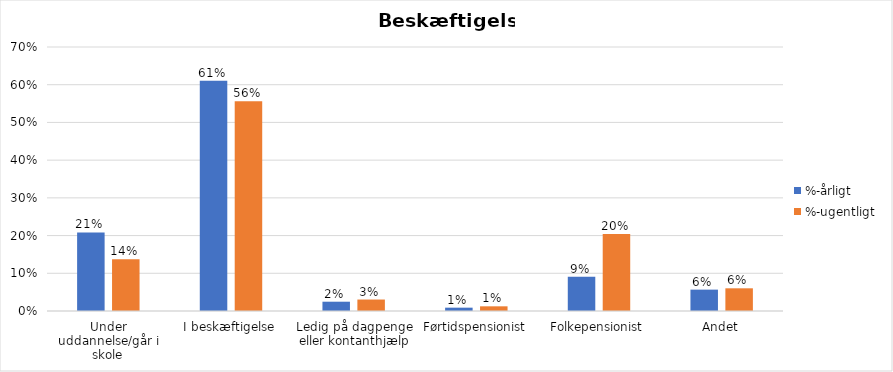
| Category | %-årligt | %-ugentligt |
|---|---|---|
| Under uddannelse/går i skole | 0.208 | 0.137 |
| I beskæftigelse | 0.611 | 0.556 |
| Ledig på dagpenge eller kontanthjælp | 0.025 | 0.03 |
| Førtidspensionist | 0.009 | 0.012 |
| Folkepensionist | 0.091 | 0.204 |
| Andet | 0.057 | 0.06 |